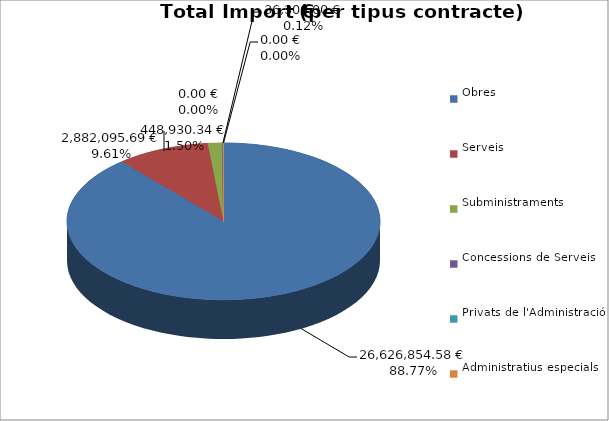
| Category | Total preu
(amb IVA) |
|---|---|
| Obres | 26626854.58 |
| Serveis | 2882095.69 |
| Subministraments | 448930.34 |
| Concessions de Serveis | 0 |
| Privats de l'Administració | 36300 |
| Administratius especials | 0 |